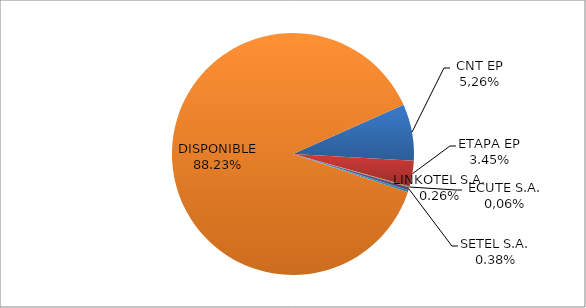
| Category | CODIGO DE AREA 7 |
|---|---|
| CORPORACIÓN NACIONAL TELECOMUNICACIONES CNT EP | 0.076 |
| ETAPA EP | 0.035 |
| CONECEL (ex ECUADORTELECOM S.A.) | 0.001 |
| SETEL S.A. | 0.004 |
| LINKOTEL S.A. | 0.003 |
| DISPONIBLE | 0.882 |